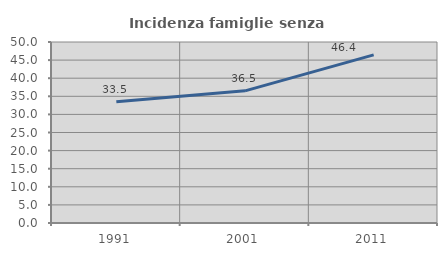
| Category | Incidenza famiglie senza nuclei |
|---|---|
| 1991.0 | 33.504 |
| 2001.0 | 36.512 |
| 2011.0 | 46.429 |